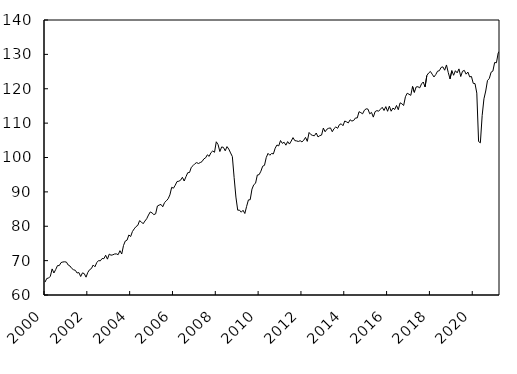
| Category | Indice mensuel |
|---|---|
| 2000 | 63.744 |
| 2000m02 | 64.818 |
| 2000m03 | 64.921 |
| 2000m04 | 65.462 |
| 2000m05 | 67.589 |
| 2000m06 | 66.4 |
| 2000m07 | 67.421 |
| 2000m08 | 68.548 |
| 2000m09 | 68.561 |
| 2000m10 | 69.435 |
| 2000m11 | 69.597 |
| 2000m12 | 69.666 |
| 2001 | 69.571 |
| 2001m02 | 68.724 |
| 2001m03 | 68.432 |
| 2001m04 | 67.732 |
| 2001m05 | 67.346 |
| 2001m06 | 67.173 |
| 2001m07 | 66.398 |
| 2001m08 | 66.527 |
| 2001m09 | 65.373 |
| 2001m10 | 66.438 |
| 2001m11 | 66.218 |
| 2001m12 | 65.188 |
| 2002 | 66.58 |
| 2002m02 | 67.363 |
| 2002m03 | 67.694 |
| 2002m04 | 68.73 |
| 2002m05 | 68.211 |
| 2002m06 | 69.427 |
| 2002m07 | 70.005 |
| 2002m08 | 69.939 |
| 2002m09 | 70.617 |
| 2002m10 | 70.566 |
| 2002m11 | 71.571 |
| 2002m12 | 70.43 |
| 2003 | 71.89 |
| 2003m02 | 71.575 |
| 2003m03 | 71.688 |
| 2003m04 | 71.923 |
| 2003m05 | 71.962 |
| 2003m06 | 71.731 |
| 2003m07 | 72.892 |
| 2003m08 | 71.92 |
| 2003m09 | 74.408 |
| 2003m10 | 75.696 |
| 2003m11 | 75.967 |
| 2003m12 | 77.465 |
| 2004 | 77.01 |
| 2004m02 | 78.467 |
| 2004m03 | 79.237 |
| 2004m04 | 79.901 |
| 2004m05 | 80.251 |
| 2004m06 | 81.618 |
| 2004m07 | 81.257 |
| 2004m08 | 80.727 |
| 2004m09 | 81.512 |
| 2004m10 | 82.188 |
| 2004m11 | 83.275 |
| 2004m12 | 84.166 |
| 2005 | 83.88 |
| 2005m02 | 83.389 |
| 2005m03 | 83.612 |
| 2005m04 | 85.894 |
| 2005m05 | 86.161 |
| 2005m06 | 86.348 |
| 2005m07 | 85.661 |
| 2005m08 | 86.892 |
| 2005m09 | 87.398 |
| 2005m10 | 87.99 |
| 2005m11 | 89.132 |
| 2005m12 | 91.319 |
| 2006 | 91.075 |
| 2006m02 | 91.953 |
| 2006m03 | 93.008 |
| 2006m04 | 93.097 |
| 2006m05 | 93.401 |
| 2006m06 | 94.247 |
| 2006m07 | 93.163 |
| 2006m08 | 94.404 |
| 2006m09 | 95.575 |
| 2006m10 | 95.638 |
| 2006m11 | 97.163 |
| 2006m12 | 97.638 |
| 2007 | 98.199 |
| 2007m02 | 98.512 |
| 2007m03 | 98.253 |
| 2007m04 | 98.525 |
| 2007m05 | 98.803 |
| 2007m06 | 99.579 |
| 2007m07 | 99.897 |
| 2007m08 | 100.784 |
| 2007m09 | 100.327 |
| 2007m10 | 101.412 |
| 2007m11 | 101.887 |
| 2007m12 | 101.522 |
| 2008 | 104.577 |
| 2008m02 | 103.743 |
| 2008m03 | 101.734 |
| 2008m04 | 103.074 |
| 2008m05 | 102.938 |
| 2008m06 | 101.947 |
| 2008m07 | 103.168 |
| 2008m08 | 102.441 |
| 2008m09 | 101.332 |
| 2008m10 | 100.276 |
| 2008m11 | 94.14 |
| 2008m12 | 88.488 |
| 2009 | 84.675 |
| 2009m02 | 84.685 |
| 2009m03 | 84.091 |
| 2009m04 | 84.651 |
| 2009m05 | 83.707 |
| 2009m06 | 85.787 |
| 2009m07 | 87.661 |
| 2009m08 | 87.721 |
| 2009m09 | 90.799 |
| 2009m10 | 92.069 |
| 2009m11 | 92.509 |
| 2009m12 | 94.906 |
| 2010 | 95.005 |
| 2010m02 | 96.021 |
| 2010m03 | 97.467 |
| 2010m04 | 97.714 |
| 2010m05 | 99.999 |
| 2010m06 | 101.202 |
| 2010m07 | 100.651 |
| 2010m08 | 101.166 |
| 2010m09 | 101.048 |
| 2010m10 | 102.706 |
| 2010m11 | 103.637 |
| 2010m12 | 103.383 |
| 2011 | 104.94 |
| 2011m02 | 104.112 |
| 2011m03 | 104.442 |
| 2011m04 | 103.585 |
| 2011m05 | 104.627 |
| 2011m06 | 103.913 |
| 2011m07 | 104.787 |
| 2011m08 | 105.783 |
| 2011m09 | 104.913 |
| 2011m10 | 104.825 |
| 2011m11 | 104.659 |
| 2011m12 | 104.885 |
| 2012 | 104.542 |
| 2012m02 | 105.015 |
| 2012m03 | 105.855 |
| 2012m04 | 104.698 |
| 2012m05 | 107.279 |
| 2012m06 | 106.67 |
| 2012m07 | 106.415 |
| 2012m08 | 106.327 |
| 2012m09 | 107.125 |
| 2012m10 | 105.981 |
| 2012m11 | 106.356 |
| 2012m12 | 106.526 |
| 2013 | 108.556 |
| 2013m02 | 107.488 |
| 2013m03 | 108.235 |
| 2013m04 | 108.512 |
| 2013m05 | 108.608 |
| 2013m06 | 107.498 |
| 2013m07 | 108.406 |
| 2013m08 | 108.898 |
| 2013m09 | 108.498 |
| 2013m10 | 109.559 |
| 2013m11 | 109.8 |
| 2013m12 | 109.253 |
| 2014 | 110.616 |
| 2014m02 | 110.366 |
| 2014m03 | 110.066 |
| 2014m04 | 110.968 |
| 2014m05 | 110.6 |
| 2014m06 | 110.779 |
| 2014m07 | 111.504 |
| 2014m08 | 111.503 |
| 2014m09 | 113.326 |
| 2014m10 | 113.042 |
| 2014m11 | 112.709 |
| 2014m12 | 113.76 |
| 2015 | 114.167 |
| 2015m02 | 114.075 |
| 2015m03 | 112.705 |
| 2015m04 | 113.122 |
| 2015m05 | 111.747 |
| 2015m06 | 113.338 |
| 2015m07 | 113.643 |
| 2015m08 | 113.468 |
| 2015m09 | 114.057 |
| 2015m10 | 114.603 |
| 2015m11 | 113.677 |
| 2015m12 | 114.799 |
| 2016 | 113.444 |
| 2016m02 | 114.934 |
| 2016m03 | 113.466 |
| 2016m04 | 114.382 |
| 2016m05 | 113.961 |
| 2016m06 | 115.138 |
| 2016m07 | 113.901 |
| 2016m08 | 115.904 |
| 2016m09 | 115.628 |
| 2016m10 | 115.133 |
| 2016m11 | 117.675 |
| 2016m12 | 118.697 |
| 2017 | 118.397 |
| 2017m02 | 118.08 |
| 2017m03 | 120.666 |
| 2017m04 | 118.944 |
| 2017m05 | 120.522 |
| 2017m06 | 120.597 |
| 2017m07 | 120.251 |
| 2017m08 | 121.4 |
| 2017m09 | 121.959 |
| 2017m10 | 120.522 |
| 2017m11 | 123.839 |
| 2017m12 | 124.59 |
| 2018 | 125.026 |
| 2018m02 | 124.234 |
| 2018m03 | 123.424 |
| 2018m04 | 124.128 |
| 2018m05 | 125.106 |
| 2018m06 | 125.248 |
| 2018m07 | 126.205 |
| 2018m08 | 126.364 |
| 2018m09 | 125.395 |
| 2018m10 | 126.92 |
| 2018m11 | 124.724 |
| 2018m12 | 122.857 |
| 2019 | 125.268 |
| 2019m02 | 123.922 |
| 2019m03 | 125.241 |
| 2019m04 | 124.627 |
| 2019m05 | 125.775 |
| 2019m06 | 123.558 |
| 2019m07 | 125.106 |
| 2019m08 | 125.336 |
| 2019m09 | 124.249 |
| 2019m10 | 124.854 |
| 2019m11 | 123.468 |
| 2019m12 | 123.569 |
| 2020 | 121.565 |
| 2020m02 | 121.492 |
| 2020m03 | 118.725 |
| 2020m04 | 104.653 |
| 2020m05 | 104.276 |
| 2020m06 | 112.211 |
| 2020m07 | 117.068 |
| 2020m08 | 119.341 |
| 2020m09 | 122.441 |
| 2020m10 | 122.954 |
| 2020m11 | 124.812 |
| 2020m12 | 125.13 |
| 2021 | 127.64 |
| 2021m02 | 127.56 |
| 2021m03 | 130.434 |
| 2021m04 | 131.11 |